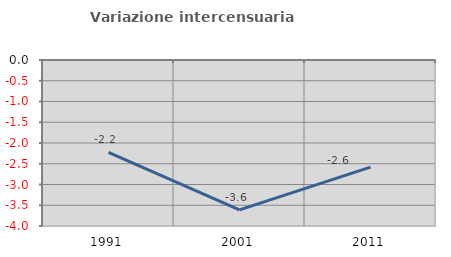
| Category | Variazione intercensuaria annua |
|---|---|
| 1991.0 | -2.228 |
| 2001.0 | -3.61 |
| 2011.0 | -2.582 |